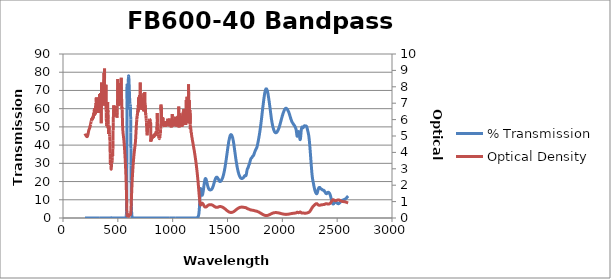
| Category | % Transmission |
|---|---|
| 2600.0 | 12.088 |
| 2599.0 | 12.024 |
| 2598.0 | 11.945 |
| 2597.0 | 11.852 |
| 2596.0 | 11.781 |
| 2595.0 | 11.749 |
| 2594.0 | 11.698 |
| 2593.0 | 11.626 |
| 2592.0 | 11.55 |
| 2591.0 | 11.475 |
| 2590.0 | 11.388 |
| 2589.0 | 11.308 |
| 2588.0 | 11.244 |
| 2587.0 | 11.174 |
| 2586.0 | 11.103 |
| 2585.0 | 11.022 |
| 2584.0 | 10.943 |
| 2583.0 | 10.886 |
| 2582.0 | 10.82 |
| 2581.0 | 10.776 |
| 2580.0 | 10.719 |
| 2579.0 | 10.668 |
| 2578.0 | 10.616 |
| 2577.0 | 10.562 |
| 2576.0 | 10.504 |
| 2575.0 | 10.454 |
| 2574.0 | 10.401 |
| 2573.0 | 10.364 |
| 2572.0 | 10.336 |
| 2571.0 | 10.315 |
| 2570.0 | 10.286 |
| 2569.0 | 10.258 |
| 2568.0 | 10.228 |
| 2567.0 | 10.186 |
| 2566.0 | 10.153 |
| 2565.0 | 10.121 |
| 2564.0 | 10.084 |
| 2563.0 | 10.085 |
| 2562.0 | 10.073 |
| 2561.0 | 10.053 |
| 2560.0 | 10.052 |
| 2559.0 | 10.033 |
| 2558.0 | 10.026 |
| 2557.0 | 9.988 |
| 2556.0 | 9.961 |
| 2555.0 | 9.93 |
| 2554.0 | 9.906 |
| 2553.0 | 9.857 |
| 2552.0 | 9.844 |
| 2551.0 | 9.828 |
| 2550.0 | 9.8 |
| 2549.0 | 9.774 |
| 2548.0 | 9.735 |
| 2547.0 | 9.714 |
| 2546.0 | 9.678 |
| 2545.0 | 9.637 |
| 2544.0 | 9.603 |
| 2543.0 | 9.558 |
| 2542.0 | 9.521 |
| 2541.0 | 9.468 |
| 2540.0 | 9.435 |
| 2539.0 | 9.381 |
| 2538.0 | 9.325 |
| 2537.0 | 9.271 |
| 2536.0 | 9.228 |
| 2535.0 | 9.161 |
| 2534.0 | 9.098 |
| 2533.0 | 9.033 |
| 2532.0 | 8.983 |
| 2531.0 | 8.903 |
| 2530.0 | 8.838 |
| 2529.0 | 8.762 |
| 2528.0 | 8.678 |
| 2527.0 | 8.596 |
| 2526.0 | 8.525 |
| 2525.0 | 8.452 |
| 2524.0 | 8.369 |
| 2523.0 | 8.305 |
| 2522.0 | 8.236 |
| 2521.0 | 8.174 |
| 2520.0 | 8.112 |
| 2519.0 | 8.058 |
| 2518.0 | 8.012 |
| 2517.0 | 7.968 |
| 2516.0 | 7.927 |
| 2515.0 | 7.912 |
| 2514.0 | 7.875 |
| 2513.0 | 7.856 |
| 2512.0 | 7.847 |
| 2511.0 | 7.842 |
| 2510.0 | 7.848 |
| 2509.0 | 7.859 |
| 2508.0 | 7.868 |
| 2507.0 | 7.887 |
| 2506.0 | 7.912 |
| 2505.0 | 7.95 |
| 2504.0 | 7.978 |
| 2503.0 | 8.02 |
| 2502.0 | 8.069 |
| 2501.0 | 8.116 |
| 2500.0 | 8.161 |
| 2499.0 | 8.207 |
| 2498.0 | 8.265 |
| 2497.0 | 8.306 |
| 2496.0 | 8.359 |
| 2495.0 | 8.409 |
| 2494.0 | 8.46 |
| 2493.0 | 8.514 |
| 2492.0 | 8.564 |
| 2491.0 | 8.603 |
| 2490.0 | 8.642 |
| 2489.0 | 8.681 |
| 2488.0 | 8.713 |
| 2487.0 | 8.735 |
| 2486.0 | 8.753 |
| 2485.0 | 8.774 |
| 2484.0 | 8.775 |
| 2483.0 | 8.772 |
| 2482.0 | 8.765 |
| 2481.0 | 8.741 |
| 2480.0 | 8.7 |
| 2479.0 | 8.664 |
| 2478.0 | 8.61 |
| 2477.0 | 8.537 |
| 2476.0 | 8.47 |
| 2475.0 | 8.387 |
| 2474.0 | 8.296 |
| 2473.0 | 8.217 |
| 2472.0 | 8.122 |
| 2471.0 | 8.035 |
| 2470.0 | 7.957 |
| 2469.0 | 7.882 |
| 2468.0 | 7.815 |
| 2467.0 | 7.758 |
| 2466.0 | 7.72 |
| 2465.0 | 7.691 |
| 2464.0 | 7.686 |
| 2463.0 | 7.692 |
| 2462.0 | 7.725 |
| 2461.0 | 7.771 |
| 2460.0 | 7.84 |
| 2459.0 | 7.925 |
| 2458.0 | 8.032 |
| 2457.0 | 8.164 |
| 2456.0 | 8.309 |
| 2455.0 | 8.478 |
| 2454.0 | 8.658 |
| 2453.0 | 8.852 |
| 2452.0 | 9.072 |
| 2451.0 | 9.29 |
| 2450.0 | 9.52 |
| 2449.0 | 9.771 |
| 2448.0 | 10.017 |
| 2447.0 | 10.268 |
| 2446.0 | 10.522 |
| 2445.0 | 10.749 |
| 2444.0 | 11.006 |
| 2443.0 | 11.248 |
| 2442.0 | 11.497 |
| 2441.0 | 11.726 |
| 2440.0 | 11.958 |
| 2439.0 | 12.168 |
| 2438.0 | 12.352 |
| 2437.0 | 12.547 |
| 2436.0 | 12.706 |
| 2435.0 | 12.878 |
| 2434.0 | 13.022 |
| 2433.0 | 13.165 |
| 2432.0 | 13.303 |
| 2431.0 | 13.425 |
| 2430.0 | 13.526 |
| 2429.0 | 13.622 |
| 2428.0 | 13.69 |
| 2427.0 | 13.762 |
| 2426.0 | 13.844 |
| 2425.0 | 13.892 |
| 2424.0 | 13.973 |
| 2423.0 | 14.026 |
| 2422.0 | 14.053 |
| 2421.0 | 14.081 |
| 2420.0 | 14.083 |
| 2419.0 | 14.084 |
| 2418.0 | 14.083 |
| 2417.0 | 14.07 |
| 2416.0 | 14.048 |
| 2415.0 | 14.048 |
| 2414.0 | 13.989 |
| 2413.0 | 13.932 |
| 2412.0 | 13.876 |
| 2411.0 | 13.771 |
| 2410.0 | 13.717 |
| 2409.0 | 13.661 |
| 2408.0 | 13.575 |
| 2407.0 | 13.529 |
| 2406.0 | 13.455 |
| 2405.0 | 13.407 |
| 2404.0 | 13.374 |
| 2403.0 | 13.354 |
| 2402.0 | 13.349 |
| 2401.0 | 13.367 |
| 2400.0 | 13.4 |
| 2399.0 | 13.436 |
| 2398.0 | 13.489 |
| 2397.0 | 13.551 |
| 2396.0 | 13.627 |
| 2395.0 | 13.708 |
| 2394.0 | 13.798 |
| 2393.0 | 13.894 |
| 2392.0 | 13.988 |
| 2391.0 | 14.082 |
| 2390.0 | 14.18 |
| 2389.0 | 14.262 |
| 2388.0 | 14.362 |
| 2387.0 | 14.457 |
| 2386.0 | 14.548 |
| 2385.0 | 14.65 |
| 2384.0 | 14.749 |
| 2383.0 | 14.821 |
| 2382.0 | 14.912 |
| 2381.0 | 14.973 |
| 2380.0 | 15.032 |
| 2379.0 | 15.095 |
| 2378.0 | 15.148 |
| 2377.0 | 15.2 |
| 2376.0 | 15.22 |
| 2375.0 | 15.249 |
| 2374.0 | 15.252 |
| 2373.0 | 15.253 |
| 2372.0 | 15.27 |
| 2371.0 | 15.285 |
| 2370.0 | 15.294 |
| 2369.0 | 15.309 |
| 2368.0 | 15.325 |
| 2367.0 | 15.347 |
| 2366.0 | 15.38 |
| 2365.0 | 15.411 |
| 2364.0 | 15.455 |
| 2363.0 | 15.508 |
| 2362.0 | 15.564 |
| 2361.0 | 15.618 |
| 2360.0 | 15.679 |
| 2359.0 | 15.724 |
| 2358.0 | 15.801 |
| 2357.0 | 15.831 |
| 2356.0 | 15.859 |
| 2355.0 | 15.908 |
| 2354.0 | 15.935 |
| 2353.0 | 15.956 |
| 2352.0 | 16 |
| 2351.0 | 16.054 |
| 2350.0 | 16.111 |
| 2349.0 | 16.175 |
| 2348.0 | 16.248 |
| 2347.0 | 16.33 |
| 2346.0 | 16.403 |
| 2345.0 | 16.46 |
| 2344.0 | 16.551 |
| 2343.0 | 16.606 |
| 2342.0 | 16.684 |
| 2341.0 | 16.763 |
| 2340.0 | 16.78 |
| 2339.0 | 16.798 |
| 2338.0 | 16.782 |
| 2337.0 | 16.771 |
| 2336.0 | 16.753 |
| 2335.0 | 16.684 |
| 2334.0 | 16.663 |
| 2333.0 | 16.563 |
| 2332.0 | 16.45 |
| 2331.0 | 16.353 |
| 2330.0 | 16.222 |
| 2329.0 | 16.072 |
| 2328.0 | 15.921 |
| 2327.0 | 15.722 |
| 2326.0 | 15.526 |
| 2325.0 | 15.309 |
| 2324.0 | 15.085 |
| 2323.0 | 14.848 |
| 2322.0 | 14.602 |
| 2321.0 | 14.371 |
| 2320.0 | 14.121 |
| 2319.0 | 13.919 |
| 2318.0 | 13.76 |
| 2317.0 | 13.581 |
| 2316.0 | 13.46 |
| 2315.0 | 13.375 |
| 2314.0 | 13.311 |
| 2313.0 | 13.32 |
| 2312.0 | 13.327 |
| 2311.0 | 13.355 |
| 2310.0 | 13.437 |
| 2309.0 | 13.502 |
| 2308.0 | 13.573 |
| 2307.0 | 13.687 |
| 2306.0 | 13.789 |
| 2305.0 | 13.9 |
| 2304.0 | 14.04 |
| 2303.0 | 14.174 |
| 2302.0 | 14.293 |
| 2301.0 | 14.459 |
| 2300.0 | 14.627 |
| 2299.0 | 14.776 |
| 2298.0 | 14.995 |
| 2297.0 | 15.175 |
| 2296.0 | 15.4 |
| 2295.0 | 15.648 |
| 2294.0 | 15.873 |
| 2293.0 | 16.132 |
| 2292.0 | 16.416 |
| 2291.0 | 16.679 |
| 2290.0 | 16.969 |
| 2289.0 | 17.274 |
| 2288.0 | 17.57 |
| 2287.0 | 17.902 |
| 2286.0 | 18.207 |
| 2285.0 | 18.524 |
| 2284.0 | 18.825 |
| 2283.0 | 19.16 |
| 2282.0 | 19.465 |
| 2281.0 | 19.785 |
| 2280.0 | 20.115 |
| 2279.0 | 20.416 |
| 2278.0 | 20.738 |
| 2277.0 | 21.077 |
| 2276.0 | 21.461 |
| 2275.0 | 21.857 |
| 2274.0 | 22.306 |
| 2273.0 | 22.787 |
| 2272.0 | 23.302 |
| 2271.0 | 23.883 |
| 2270.0 | 24.468 |
| 2269.0 | 25.119 |
| 2268.0 | 25.886 |
| 2267.0 | 26.588 |
| 2266.0 | 27.314 |
| 2265.0 | 28.1 |
| 2264.0 | 28.868 |
| 2263.0 | 29.616 |
| 2262.0 | 30.466 |
| 2261.0 | 31.256 |
| 2260.0 | 32.057 |
| 2259.0 | 32.885 |
| 2258.0 | 33.709 |
| 2257.0 | 34.491 |
| 2256.0 | 35.293 |
| 2255.0 | 36.123 |
| 2254.0 | 36.88 |
| 2253.0 | 37.714 |
| 2252.0 | 38.48 |
| 2251.0 | 39.226 |
| 2250.0 | 39.919 |
| 2249.0 | 40.637 |
| 2248.0 | 41.358 |
| 2247.0 | 42.047 |
| 2246.0 | 42.59 |
| 2245.0 | 43.208 |
| 2244.0 | 43.712 |
| 2243.0 | 44.231 |
| 2242.0 | 44.743 |
| 2241.0 | 45.14 |
| 2240.0 | 45.504 |
| 2239.0 | 45.929 |
| 2238.0 | 46.194 |
| 2237.0 | 46.514 |
| 2236.0 | 46.794 |
| 2235.0 | 47.073 |
| 2234.0 | 47.27 |
| 2233.0 | 47.534 |
| 2232.0 | 47.775 |
| 2231.0 | 48.027 |
| 2230.0 | 48.232 |
| 2229.0 | 48.561 |
| 2228.0 | 48.783 |
| 2227.0 | 49.029 |
| 2226.0 | 49.312 |
| 2225.0 | 49.468 |
| 2224.0 | 49.762 |
| 2223.0 | 49.926 |
| 2222.0 | 50.079 |
| 2221.0 | 50.216 |
| 2220.0 | 50.289 |
| 2219.0 | 50.379 |
| 2218.0 | 50.44 |
| 2217.0 | 50.471 |
| 2216.0 | 50.476 |
| 2215.0 | 50.552 |
| 2214.0 | 50.438 |
| 2213.0 | 50.453 |
| 2212.0 | 50.496 |
| 2211.0 | 50.441 |
| 2210.0 | 50.551 |
| 2209.0 | 50.467 |
| 2208.0 | 50.533 |
| 2207.0 | 50.47 |
| 2206.0 | 50.503 |
| 2205.0 | 50.574 |
| 2204.0 | 50.509 |
| 2203.0 | 50.598 |
| 2202.0 | 50.591 |
| 2201.0 | 50.573 |
| 2200.0 | 50.574 |
| 2199.0 | 50.48 |
| 2198.0 | 50.439 |
| 2197.0 | 50.38 |
| 2196.0 | 50.303 |
| 2195.0 | 50.163 |
| 2194.0 | 50.046 |
| 2193.0 | 49.858 |
| 2192.0 | 49.746 |
| 2191.0 | 49.691 |
| 2190.0 | 49.611 |
| 2189.0 | 49.632 |
| 2188.0 | 49.489 |
| 2187.0 | 49.577 |
| 2186.0 | 49.616 |
| 2185.0 | 49.693 |
| 2184.0 | 49.818 |
| 2183.0 | 49.849 |
| 2182.0 | 49.93 |
| 2181.0 | 49.929 |
| 2180.0 | 49.917 |
| 2179.0 | 49.907 |
| 2178.0 | 49.833 |
| 2177.0 | 49.754 |
| 2176.0 | 49.517 |
| 2175.0 | 49.206 |
| 2174.0 | 48.84 |
| 2173.0 | 48.364 |
| 2172.0 | 47.858 |
| 2171.0 | 47.23 |
| 2170.0 | 46.536 |
| 2169.0 | 45.799 |
| 2168.0 | 45.196 |
| 2167.0 | 44.526 |
| 2166.0 | 43.968 |
| 2165.0 | 43.493 |
| 2164.0 | 43.163 |
| 2163.0 | 43.016 |
| 2162.0 | 43.036 |
| 2161.0 | 43.167 |
| 2160.0 | 43.414 |
| 2159.0 | 43.814 |
| 2158.0 | 44.221 |
| 2157.0 | 44.702 |
| 2156.0 | 45.159 |
| 2155.0 | 45.652 |
| 2154.0 | 46.068 |
| 2153.0 | 46.504 |
| 2152.0 | 46.82 |
| 2151.0 | 47.105 |
| 2150.0 | 47.289 |
| 2149.0 | 47.407 |
| 2148.0 | 47.425 |
| 2147.0 | 47.378 |
| 2146.0 | 47.261 |
| 2145.0 | 47.062 |
| 2144.0 | 46.791 |
| 2143.0 | 46.552 |
| 2142.0 | 46.213 |
| 2141.0 | 45.835 |
| 2140.0 | 45.509 |
| 2139.0 | 45.229 |
| 2138.0 | 44.994 |
| 2137.0 | 44.857 |
| 2136.0 | 44.82 |
| 2135.0 | 44.873 |
| 2134.0 | 45.065 |
| 2133.0 | 45.367 |
| 2132.0 | 45.777 |
| 2131.0 | 46.249 |
| 2130.0 | 46.695 |
| 2129.0 | 47.183 |
| 2128.0 | 47.588 |
| 2127.0 | 48.036 |
| 2126.0 | 48.397 |
| 2125.0 | 48.64 |
| 2124.0 | 48.892 |
| 2123.0 | 49.116 |
| 2122.0 | 49.263 |
| 2121.0 | 49.399 |
| 2120.0 | 49.547 |
| 2119.0 | 49.666 |
| 2118.0 | 49.834 |
| 2117.0 | 49.948 |
| 2116.0 | 50.033 |
| 2115.0 | 50.14 |
| 2114.0 | 50.289 |
| 2113.0 | 50.371 |
| 2112.0 | 50.546 |
| 2111.0 | 50.58 |
| 2110.0 | 50.678 |
| 2109.0 | 50.811 |
| 2108.0 | 50.835 |
| 2107.0 | 50.988 |
| 2106.0 | 51.107 |
| 2105.0 | 51.142 |
| 2104.0 | 51.305 |
| 2103.0 | 51.361 |
| 2102.0 | 51.423 |
| 2101.0 | 51.481 |
| 2100.0 | 51.59 |
| 2099.0 | 51.712 |
| 2098.0 | 51.801 |
| 2097.0 | 51.842 |
| 2096.0 | 51.996 |
| 2095.0 | 52.056 |
| 2094.0 | 52.136 |
| 2093.0 | 52.234 |
| 2092.0 | 52.366 |
| 2091.0 | 52.486 |
| 2090.0 | 52.544 |
| 2089.0 | 52.661 |
| 2088.0 | 52.82 |
| 2087.0 | 52.955 |
| 2086.0 | 52.975 |
| 2085.0 | 53.214 |
| 2084.0 | 53.35 |
| 2083.0 | 53.514 |
| 2082.0 | 53.686 |
| 2081.0 | 53.851 |
| 2080.0 | 53.998 |
| 2079.0 | 54.191 |
| 2078.0 | 54.361 |
| 2077.0 | 54.515 |
| 2076.0 | 54.77 |
| 2075.0 | 54.915 |
| 2074.0 | 55.139 |
| 2073.0 | 55.291 |
| 2072.0 | 55.553 |
| 2071.0 | 55.738 |
| 2070.0 | 55.937 |
| 2069.0 | 56.123 |
| 2068.0 | 56.295 |
| 2067.0 | 56.528 |
| 2066.0 | 56.738 |
| 2065.0 | 56.916 |
| 2064.0 | 57.095 |
| 2063.0 | 57.231 |
| 2062.0 | 57.466 |
| 2061.0 | 57.656 |
| 2060.0 | 57.806 |
| 2059.0 | 57.988 |
| 2058.0 | 58.098 |
| 2057.0 | 58.237 |
| 2056.0 | 58.382 |
| 2055.0 | 58.582 |
| 2054.0 | 58.683 |
| 2053.0 | 58.845 |
| 2052.0 | 58.897 |
| 2051.0 | 59.071 |
| 2050.0 | 59.133 |
| 2049.0 | 59.272 |
| 2048.0 | 59.411 |
| 2047.0 | 59.437 |
| 2046.0 | 59.564 |
| 2045.0 | 59.609 |
| 2044.0 | 59.715 |
| 2043.0 | 59.785 |
| 2042.0 | 59.855 |
| 2041.0 | 59.933 |
| 2040.0 | 59.988 |
| 2039.0 | 60.023 |
| 2038.0 | 60.061 |
| 2037.0 | 60.194 |
| 2036.0 | 60.102 |
| 2035.0 | 60.204 |
| 2034.0 | 60.152 |
| 2033.0 | 60.26 |
| 2032.0 | 60.161 |
| 2031.0 | 60.14 |
| 2030.0 | 60.197 |
| 2029.0 | 60.086 |
| 2028.0 | 60.126 |
| 2027.0 | 60.053 |
| 2026.0 | 59.989 |
| 2025.0 | 59.856 |
| 2024.0 | 59.8 |
| 2023.0 | 59.758 |
| 2022.0 | 59.701 |
| 2021.0 | 59.605 |
| 2020.0 | 59.44 |
| 2019.0 | 59.265 |
| 2018.0 | 59.158 |
| 2017.0 | 59.055 |
| 2016.0 | 58.936 |
| 2015.0 | 58.796 |
| 2014.0 | 58.64 |
| 2013.0 | 58.397 |
| 2012.0 | 58.249 |
| 2011.0 | 58.082 |
| 2010.0 | 57.955 |
| 2009.0 | 57.742 |
| 2008.0 | 57.57 |
| 2007.0 | 57.354 |
| 2006.0 | 57.277 |
| 2005.0 | 57.045 |
| 2004.0 | 56.877 |
| 2003.0 | 56.626 |
| 2002.0 | 56.423 |
| 2001.0 | 56.267 |
| 2000.0 | 56.122 |
| 1999.0 | 55.868 |
| 1998.0 | 55.599 |
| 1997.0 | 55.393 |
| 1996.0 | 55.233 |
| 1995.0 | 55.04 |
| 1994.0 | 54.794 |
| 1993.0 | 54.546 |
| 1992.0 | 54.287 |
| 1991.0 | 54.125 |
| 1990.0 | 53.855 |
| 1989.0 | 53.673 |
| 1988.0 | 53.419 |
| 1987.0 | 53.143 |
| 1986.0 | 52.894 |
| 1985.0 | 52.742 |
| 1984.0 | 52.528 |
| 1983.0 | 52.284 |
| 1982.0 | 52.051 |
| 1981.0 | 51.814 |
| 1980.0 | 51.647 |
| 1979.0 | 51.401 |
| 1978.0 | 51.199 |
| 1977.0 | 50.952 |
| 1976.0 | 50.786 |
| 1975.0 | 50.545 |
| 1974.0 | 50.448 |
| 1973.0 | 50.171 |
| 1972.0 | 49.932 |
| 1971.0 | 49.747 |
| 1970.0 | 49.6 |
| 1969.0 | 49.403 |
| 1968.0 | 49.283 |
| 1967.0 | 49.072 |
| 1966.0 | 48.908 |
| 1965.0 | 48.761 |
| 1964.0 | 48.644 |
| 1963.0 | 48.498 |
| 1962.0 | 48.36 |
| 1961.0 | 48.18 |
| 1960.0 | 48.049 |
| 1959.0 | 47.984 |
| 1958.0 | 47.827 |
| 1957.0 | 47.775 |
| 1956.0 | 47.607 |
| 1955.0 | 47.537 |
| 1954.0 | 47.416 |
| 1953.0 | 47.364 |
| 1952.0 | 47.229 |
| 1951.0 | 47.196 |
| 1950.0 | 47.071 |
| 1949.0 | 47.077 |
| 1948.0 | 47.009 |
| 1947.0 | 46.962 |
| 1946.0 | 46.849 |
| 1945.0 | 46.825 |
| 1944.0 | 46.825 |
| 1943.0 | 46.834 |
| 1942.0 | 46.774 |
| 1941.0 | 46.76 |
| 1940.0 | 46.737 |
| 1939.0 | 46.783 |
| 1938.0 | 46.784 |
| 1937.0 | 46.857 |
| 1936.0 | 46.848 |
| 1935.0 | 46.906 |
| 1934.0 | 46.984 |
| 1933.0 | 47.055 |
| 1932.0 | 47.053 |
| 1931.0 | 47.18 |
| 1930.0 | 47.25 |
| 1929.0 | 47.35 |
| 1928.0 | 47.454 |
| 1927.0 | 47.622 |
| 1926.0 | 47.739 |
| 1925.0 | 47.866 |
| 1924.0 | 48.032 |
| 1923.0 | 48.216 |
| 1922.0 | 48.314 |
| 1921.0 | 48.498 |
| 1920.0 | 48.646 |
| 1919.0 | 48.948 |
| 1918.0 | 49.176 |
| 1917.0 | 49.346 |
| 1916.0 | 49.522 |
| 1915.0 | 49.715 |
| 1914.0 | 49.983 |
| 1913.0 | 50.264 |
| 1912.0 | 50.542 |
| 1911.0 | 50.816 |
| 1910.0 | 51.094 |
| 1909.0 | 51.418 |
| 1908.0 | 51.658 |
| 1907.0 | 52.023 |
| 1906.0 | 52.264 |
| 1905.0 | 52.743 |
| 1904.0 | 53.089 |
| 1903.0 | 53.547 |
| 1902.0 | 53.83 |
| 1901.0 | 54.267 |
| 1900.0 | 54.578 |
| 1899.0 | 55.105 |
| 1898.0 | 55.531 |
| 1897.0 | 56.068 |
| 1896.0 | 56.466 |
| 1895.0 | 56.942 |
| 1894.0 | 57.384 |
| 1893.0 | 57.867 |
| 1892.0 | 58.23 |
| 1891.0 | 58.85 |
| 1890.0 | 59.289 |
| 1889.0 | 59.914 |
| 1888.0 | 60.324 |
| 1887.0 | 60.801 |
| 1886.0 | 61.139 |
| 1885.0 | 61.637 |
| 1884.0 | 62.083 |
| 1883.0 | 62.609 |
| 1882.0 | 63.06 |
| 1881.0 | 63.469 |
| 1880.0 | 63.952 |
| 1879.0 | 64.35 |
| 1878.0 | 64.707 |
| 1877.0 | 65.108 |
| 1876.0 | 65.582 |
| 1875.0 | 65.951 |
| 1874.0 | 66.32 |
| 1873.0 | 66.705 |
| 1872.0 | 67.082 |
| 1871.0 | 67.419 |
| 1870.0 | 67.865 |
| 1869.0 | 68.179 |
| 1868.0 | 68.546 |
| 1867.0 | 68.807 |
| 1866.0 | 69.157 |
| 1865.0 | 69.371 |
| 1864.0 | 69.633 |
| 1863.0 | 69.772 |
| 1862.0 | 69.965 |
| 1861.0 | 70.279 |
| 1860.0 | 70.33 |
| 1859.0 | 70.549 |
| 1858.0 | 70.628 |
| 1857.0 | 70.804 |
| 1856.0 | 70.777 |
| 1855.0 | 70.823 |
| 1854.0 | 70.804 |
| 1853.0 | 70.779 |
| 1852.0 | 70.852 |
| 1851.0 | 70.861 |
| 1850.0 | 70.804 |
| 1849.0 | 70.579 |
| 1848.0 | 70.533 |
| 1847.0 | 70.306 |
| 1846.0 | 70.242 |
| 1845.0 | 69.999 |
| 1844.0 | 69.798 |
| 1843.0 | 69.476 |
| 1842.0 | 69.277 |
| 1841.0 | 68.981 |
| 1840.0 | 68.734 |
| 1839.0 | 68.437 |
| 1838.0 | 67.979 |
| 1837.0 | 67.631 |
| 1836.0 | 67.223 |
| 1835.0 | 66.893 |
| 1834.0 | 66.355 |
| 1833.0 | 66.034 |
| 1832.0 | 65.499 |
| 1831.0 | 65.064 |
| 1830.0 | 64.503 |
| 1829.0 | 64.111 |
| 1828.0 | 63.68 |
| 1827.0 | 63.073 |
| 1826.0 | 62.555 |
| 1825.0 | 62.068 |
| 1824.0 | 61.639 |
| 1823.0 | 61.185 |
| 1822.0 | 60.599 |
| 1821.0 | 60.074 |
| 1820.0 | 59.594 |
| 1819.0 | 59.1 |
| 1818.0 | 58.55 |
| 1817.0 | 58.07 |
| 1816.0 | 57.483 |
| 1815.0 | 57.035 |
| 1814.0 | 56.46 |
| 1813.0 | 55.972 |
| 1812.0 | 55.379 |
| 1811.0 | 54.838 |
| 1810.0 | 54.408 |
| 1809.0 | 53.815 |
| 1808.0 | 53.375 |
| 1807.0 | 52.866 |
| 1806.0 | 52.382 |
| 1805.0 | 51.88 |
| 1804.0 | 51.384 |
| 1803.0 | 50.963 |
| 1802.0 | 50.479 |
| 1801.0 | 50.074 |
| 1800.0 | 49.573 |
| 1799.0 | 49.101 |
| 1798.0 | 48.693 |
| 1797.0 | 48.326 |
| 1796.0 | 47.874 |
| 1795.0 | 47.43 |
| 1794.0 | 47.062 |
| 1793.0 | 46.67 |
| 1792.0 | 46.236 |
| 1791.0 | 45.846 |
| 1790.0 | 45.504 |
| 1789.0 | 45.178 |
| 1788.0 | 44.785 |
| 1787.0 | 44.472 |
| 1786.0 | 44.078 |
| 1785.0 | 43.802 |
| 1784.0 | 43.446 |
| 1783.0 | 43.088 |
| 1782.0 | 42.792 |
| 1781.0 | 42.465 |
| 1780.0 | 42.148 |
| 1779.0 | 41.8 |
| 1778.0 | 41.516 |
| 1777.0 | 41.246 |
| 1776.0 | 40.899 |
| 1775.0 | 40.59 |
| 1774.0 | 40.299 |
| 1773.0 | 40.046 |
| 1772.0 | 39.764 |
| 1771.0 | 39.512 |
| 1770.0 | 39.274 |
| 1769.0 | 39.081 |
| 1768.0 | 38.923 |
| 1767.0 | 38.735 |
| 1766.0 | 38.525 |
| 1765.0 | 38.443 |
| 1764.0 | 38.289 |
| 1763.0 | 38.22 |
| 1762.0 | 38.007 |
| 1761.0 | 37.906 |
| 1760.0 | 37.836 |
| 1759.0 | 37.69 |
| 1758.0 | 37.602 |
| 1757.0 | 37.442 |
| 1756.0 | 37.384 |
| 1755.0 | 37.22 |
| 1754.0 | 37.046 |
| 1753.0 | 36.897 |
| 1752.0 | 36.753 |
| 1751.0 | 36.619 |
| 1750.0 | 36.446 |
| 1749.0 | 36.272 |
| 1748.0 | 36.143 |
| 1747.0 | 35.935 |
| 1746.0 | 35.787 |
| 1745.0 | 35.591 |
| 1744.0 | 35.393 |
| 1743.0 | 35.253 |
| 1742.0 | 35.059 |
| 1741.0 | 34.848 |
| 1740.0 | 34.747 |
| 1739.0 | 34.589 |
| 1738.0 | 34.48 |
| 1737.0 | 34.355 |
| 1736.0 | 34.265 |
| 1735.0 | 34.202 |
| 1734.0 | 34.097 |
| 1733.0 | 34.014 |
| 1732.0 | 33.956 |
| 1731.0 | 33.908 |
| 1730.0 | 33.889 |
| 1729.0 | 33.777 |
| 1728.0 | 33.718 |
| 1727.0 | 33.654 |
| 1726.0 | 33.529 |
| 1725.0 | 33.415 |
| 1724.0 | 33.34 |
| 1723.0 | 33.211 |
| 1722.0 | 33.142 |
| 1721.0 | 33.039 |
| 1720.0 | 32.976 |
| 1719.0 | 32.923 |
| 1718.0 | 32.842 |
| 1717.0 | 32.837 |
| 1716.0 | 32.798 |
| 1715.0 | 32.701 |
| 1714.0 | 32.618 |
| 1713.0 | 32.48 |
| 1712.0 | 32.377 |
| 1711.0 | 32.206 |
| 1710.0 | 32.001 |
| 1709.0 | 31.809 |
| 1708.0 | 31.602 |
| 1707.0 | 31.354 |
| 1706.0 | 31.121 |
| 1705.0 | 30.857 |
| 1704.0 | 30.626 |
| 1703.0 | 30.362 |
| 1702.0 | 30.101 |
| 1701.0 | 29.891 |
| 1700.0 | 29.656 |
| 1699.0 | 29.486 |
| 1698.0 | 29.374 |
| 1697.0 | 29.257 |
| 1696.0 | 29.148 |
| 1695.0 | 29.015 |
| 1694.0 | 28.881 |
| 1693.0 | 28.667 |
| 1692.0 | 28.48 |
| 1691.0 | 28.224 |
| 1690.0 | 28 |
| 1689.0 | 27.791 |
| 1688.0 | 27.642 |
| 1687.0 | 27.521 |
| 1686.0 | 27.411 |
| 1685.0 | 27.331 |
| 1684.0 | 27.254 |
| 1683.0 | 27.166 |
| 1682.0 | 27.031 |
| 1681.0 | 26.876 |
| 1680.0 | 26.684 |
| 1679.0 | 26.431 |
| 1678.0 | 26.133 |
| 1677.0 | 25.812 |
| 1676.0 | 25.432 |
| 1675.0 | 25.092 |
| 1674.0 | 24.727 |
| 1673.0 | 24.397 |
| 1672.0 | 24.08 |
| 1671.0 | 23.821 |
| 1670.0 | 23.578 |
| 1669.0 | 23.432 |
| 1668.0 | 23.284 |
| 1667.0 | 23.227 |
| 1666.0 | 23.209 |
| 1665.0 | 23.245 |
| 1664.0 | 23.278 |
| 1663.0 | 23.301 |
| 1662.0 | 23.318 |
| 1661.0 | 23.354 |
| 1660.0 | 23.339 |
| 1659.0 | 23.301 |
| 1658.0 | 23.28 |
| 1657.0 | 23.21 |
| 1656.0 | 23.122 |
| 1655.0 | 23.034 |
| 1654.0 | 22.973 |
| 1653.0 | 22.878 |
| 1652.0 | 22.735 |
| 1651.0 | 22.642 |
| 1650.0 | 22.55 |
| 1649.0 | 22.431 |
| 1648.0 | 22.321 |
| 1647.0 | 22.25 |
| 1646.0 | 22.197 |
| 1645.0 | 22.118 |
| 1644.0 | 22.073 |
| 1643.0 | 22.053 |
| 1642.0 | 21.978 |
| 1641.0 | 21.963 |
| 1640.0 | 21.923 |
| 1639.0 | 21.869 |
| 1638.0 | 21.821 |
| 1637.0 | 21.78 |
| 1636.0 | 21.751 |
| 1635.0 | 21.704 |
| 1634.0 | 21.671 |
| 1633.0 | 21.676 |
| 1632.0 | 21.662 |
| 1631.0 | 21.66 |
| 1630.0 | 21.65 |
| 1629.0 | 21.692 |
| 1628.0 | 21.714 |
| 1627.0 | 21.724 |
| 1626.0 | 21.75 |
| 1625.0 | 21.789 |
| 1624.0 | 21.801 |
| 1623.0 | 21.839 |
| 1622.0 | 21.911 |
| 1621.0 | 21.947 |
| 1620.0 | 22.011 |
| 1619.0 | 22.074 |
| 1618.0 | 22.15 |
| 1617.0 | 22.236 |
| 1616.0 | 22.311 |
| 1615.0 | 22.422 |
| 1614.0 | 22.545 |
| 1613.0 | 22.648 |
| 1612.0 | 22.773 |
| 1611.0 | 22.915 |
| 1610.0 | 23.051 |
| 1609.0 | 23.197 |
| 1608.0 | 23.339 |
| 1607.0 | 23.492 |
| 1606.0 | 23.65 |
| 1605.0 | 23.833 |
| 1604.0 | 24.008 |
| 1603.0 | 24.181 |
| 1602.0 | 24.389 |
| 1601.0 | 24.605 |
| 1600.0 | 24.821 |
| 1599.0 | 25.035 |
| 1598.0 | 25.272 |
| 1597.0 | 25.515 |
| 1596.0 | 25.743 |
| 1595.0 | 26.003 |
| 1594.0 | 26.269 |
| 1593.0 | 26.539 |
| 1592.0 | 26.799 |
| 1591.0 | 27.11 |
| 1590.0 | 27.408 |
| 1589.0 | 27.719 |
| 1588.0 | 28.044 |
| 1587.0 | 28.348 |
| 1586.0 | 28.718 |
| 1585.0 | 29.02 |
| 1584.0 | 29.371 |
| 1583.0 | 29.759 |
| 1582.0 | 30.106 |
| 1581.0 | 30.508 |
| 1580.0 | 30.89 |
| 1579.0 | 31.271 |
| 1578.0 | 31.646 |
| 1577.0 | 32.059 |
| 1576.0 | 32.476 |
| 1575.0 | 32.91 |
| 1574.0 | 33.305 |
| 1573.0 | 33.77 |
| 1572.0 | 34.232 |
| 1571.0 | 34.642 |
| 1570.0 | 35.083 |
| 1569.0 | 35.542 |
| 1568.0 | 35.987 |
| 1567.0 | 36.422 |
| 1566.0 | 36.916 |
| 1565.0 | 37.297 |
| 1564.0 | 37.761 |
| 1563.0 | 38.239 |
| 1562.0 | 38.653 |
| 1561.0 | 39.087 |
| 1560.0 | 39.546 |
| 1559.0 | 39.932 |
| 1558.0 | 40.316 |
| 1557.0 | 40.751 |
| 1556.0 | 41.135 |
| 1555.0 | 41.491 |
| 1554.0 | 41.851 |
| 1553.0 | 42.206 |
| 1552.0 | 42.489 |
| 1551.0 | 42.824 |
| 1550.0 | 43.132 |
| 1549.0 | 43.432 |
| 1548.0 | 43.655 |
| 1547.0 | 43.959 |
| 1546.0 | 44.141 |
| 1545.0 | 44.352 |
| 1544.0 | 44.576 |
| 1543.0 | 44.727 |
| 1542.0 | 44.895 |
| 1541.0 | 45.107 |
| 1540.0 | 45.222 |
| 1539.0 | 45.304 |
| 1538.0 | 45.445 |
| 1537.0 | 45.563 |
| 1536.0 | 45.573 |
| 1535.0 | 45.673 |
| 1534.0 | 45.73 |
| 1533.0 | 45.676 |
| 1532.0 | 45.735 |
| 1531.0 | 45.745 |
| 1530.0 | 45.665 |
| 1529.0 | 45.66 |
| 1528.0 | 45.618 |
| 1527.0 | 45.48 |
| 1526.0 | 45.38 |
| 1525.0 | 45.282 |
| 1524.0 | 45.091 |
| 1523.0 | 44.909 |
| 1522.0 | 44.767 |
| 1521.0 | 44.478 |
| 1520.0 | 44.299 |
| 1519.0 | 44.103 |
| 1518.0 | 43.842 |
| 1517.0 | 43.547 |
| 1516.0 | 43.287 |
| 1515.0 | 42.98 |
| 1514.0 | 42.666 |
| 1513.0 | 42.415 |
| 1512.0 | 42.037 |
| 1511.0 | 41.7 |
| 1510.0 | 41.355 |
| 1509.0 | 40.965 |
| 1508.0 | 40.564 |
| 1507.0 | 40.227 |
| 1506.0 | 39.802 |
| 1505.0 | 39.363 |
| 1504.0 | 39 |
| 1503.0 | 38.54 |
| 1502.0 | 38.113 |
| 1501.0 | 37.746 |
| 1500.0 | 37.249 |
| 1499.0 | 36.812 |
| 1498.0 | 36.441 |
| 1497.0 | 35.953 |
| 1496.0 | 35.518 |
| 1495.0 | 35.082 |
| 1494.0 | 34.664 |
| 1493.0 | 34.21 |
| 1492.0 | 33.799 |
| 1491.0 | 33.323 |
| 1490.0 | 32.883 |
| 1489.0 | 32.487 |
| 1488.0 | 32.027 |
| 1487.0 | 31.63 |
| 1486.0 | 31.248 |
| 1485.0 | 30.794 |
| 1484.0 | 30.392 |
| 1483.0 | 30.004 |
| 1482.0 | 29.605 |
| 1481.0 | 29.217 |
| 1480.0 | 28.846 |
| 1479.0 | 28.447 |
| 1478.0 | 28.091 |
| 1477.0 | 27.742 |
| 1476.0 | 27.371 |
| 1475.0 | 27.04 |
| 1474.0 | 26.733 |
| 1473.0 | 26.385 |
| 1472.0 | 26.073 |
| 1471.0 | 25.742 |
| 1470.0 | 25.45 |
| 1469.0 | 25.177 |
| 1468.0 | 24.891 |
| 1467.0 | 24.616 |
| 1466.0 | 24.349 |
| 1465.0 | 24.081 |
| 1464.0 | 23.849 |
| 1463.0 | 23.605 |
| 1462.0 | 23.361 |
| 1461.0 | 23.164 |
| 1460.0 | 22.943 |
| 1459.0 | 22.736 |
| 1458.0 | 22.56 |
| 1457.0 | 22.34 |
| 1456.0 | 22.186 |
| 1455.0 | 22.009 |
| 1454.0 | 21.842 |
| 1453.0 | 21.709 |
| 1452.0 | 21.55 |
| 1451.0 | 21.422 |
| 1450.0 | 21.3 |
| 1449.0 | 21.166 |
| 1448.0 | 21.039 |
| 1447.0 | 20.949 |
| 1446.0 | 20.814 |
| 1445.0 | 20.71 |
| 1444.0 | 20.641 |
| 1443.0 | 20.537 |
| 1442.0 | 20.469 |
| 1441.0 | 20.39 |
| 1440.0 | 20.282 |
| 1439.0 | 20.256 |
| 1438.0 | 20.18 |
| 1437.0 | 20.136 |
| 1436.0 | 20.091 |
| 1435.0 | 20.046 |
| 1434.0 | 20.028 |
| 1433.0 | 20.026 |
| 1432.0 | 20 |
| 1431.0 | 20.017 |
| 1430.0 | 20.03 |
| 1429.0 | 20.038 |
| 1428.0 | 20.111 |
| 1427.0 | 20.159 |
| 1426.0 | 20.217 |
| 1425.0 | 20.331 |
| 1424.0 | 20.41 |
| 1423.0 | 20.513 |
| 1422.0 | 20.649 |
| 1421.0 | 20.75 |
| 1420.0 | 20.89 |
| 1419.0 | 21.009 |
| 1418.0 | 21.136 |
| 1417.0 | 21.288 |
| 1416.0 | 21.395 |
| 1415.0 | 21.491 |
| 1414.0 | 21.607 |
| 1413.0 | 21.73 |
| 1412.0 | 21.841 |
| 1411.0 | 21.942 |
| 1410.0 | 22.002 |
| 1409.0 | 22.088 |
| 1408.0 | 22.208 |
| 1407.0 | 22.219 |
| 1406.0 | 22.318 |
| 1405.0 | 22.305 |
| 1404.0 | 22.379 |
| 1403.0 | 22.417 |
| 1402.0 | 22.422 |
| 1401.0 | 22.392 |
| 1400.0 | 22.384 |
| 1399.0 | 22.364 |
| 1398.0 | 22.353 |
| 1397.0 | 22.218 |
| 1396.0 | 22.161 |
| 1395.0 | 22.083 |
| 1394.0 | 22.036 |
| 1393.0 | 21.903 |
| 1392.0 | 21.751 |
| 1391.0 | 21.68 |
| 1390.0 | 21.536 |
| 1389.0 | 21.378 |
| 1388.0 | 21.188 |
| 1387.0 | 21.04 |
| 1386.0 | 20.879 |
| 1385.0 | 20.675 |
| 1384.0 | 20.495 |
| 1383.0 | 20.275 |
| 1382.0 | 20.049 |
| 1381.0 | 19.895 |
| 1380.0 | 19.63 |
| 1379.0 | 19.454 |
| 1378.0 | 19.231 |
| 1377.0 | 19.015 |
| 1376.0 | 18.809 |
| 1375.0 | 18.601 |
| 1374.0 | 18.402 |
| 1373.0 | 18.204 |
| 1372.0 | 18.004 |
| 1371.0 | 17.809 |
| 1370.0 | 17.615 |
| 1369.0 | 17.458 |
| 1368.0 | 17.257 |
| 1367.0 | 17.111 |
| 1366.0 | 16.97 |
| 1365.0 | 16.803 |
| 1364.0 | 16.655 |
| 1363.0 | 16.536 |
| 1362.0 | 16.366 |
| 1361.0 | 16.257 |
| 1360.0 | 16.181 |
| 1359.0 | 16.046 |
| 1358.0 | 15.964 |
| 1357.0 | 15.883 |
| 1356.0 | 15.803 |
| 1355.0 | 15.715 |
| 1354.0 | 15.683 |
| 1353.0 | 15.642 |
| 1352.0 | 15.589 |
| 1351.0 | 15.554 |
| 1350.0 | 15.521 |
| 1349.0 | 15.491 |
| 1348.0 | 15.46 |
| 1347.0 | 15.449 |
| 1346.0 | 15.436 |
| 1345.0 | 15.423 |
| 1344.0 | 15.411 |
| 1343.0 | 15.401 |
| 1342.0 | 15.417 |
| 1341.0 | 15.415 |
| 1340.0 | 15.434 |
| 1339.0 | 15.448 |
| 1338.0 | 15.469 |
| 1337.0 | 15.495 |
| 1336.0 | 15.538 |
| 1335.0 | 15.577 |
| 1334.0 | 15.638 |
| 1333.0 | 15.696 |
| 1332.0 | 15.751 |
| 1331.0 | 15.842 |
| 1330.0 | 15.936 |
| 1329.0 | 16.037 |
| 1328.0 | 16.142 |
| 1327.0 | 16.275 |
| 1326.0 | 16.417 |
| 1325.0 | 16.569 |
| 1324.0 | 16.729 |
| 1323.0 | 16.904 |
| 1322.0 | 17.084 |
| 1321.0 | 17.284 |
| 1320.0 | 17.502 |
| 1319.0 | 17.746 |
| 1318.0 | 17.981 |
| 1317.0 | 18.222 |
| 1316.0 | 18.477 |
| 1315.0 | 18.735 |
| 1314.0 | 18.993 |
| 1313.0 | 19.264 |
| 1312.0 | 19.531 |
| 1311.0 | 19.777 |
| 1310.0 | 20.047 |
| 1309.0 | 20.293 |
| 1308.0 | 20.521 |
| 1307.0 | 20.781 |
| 1306.0 | 20.977 |
| 1305.0 | 21.151 |
| 1304.0 | 21.307 |
| 1303.0 | 21.448 |
| 1302.0 | 21.54 |
| 1301.0 | 21.604 |
| 1300.0 | 21.64 |
| 1299.0 | 21.621 |
| 1298.0 | 21.565 |
| 1297.0 | 21.479 |
| 1296.0 | 21.358 |
| 1295.0 | 21.205 |
| 1294.0 | 21.007 |
| 1293.0 | 20.75 |
| 1292.0 | 20.474 |
| 1291.0 | 20.146 |
| 1290.0 | 19.787 |
| 1289.0 | 19.41 |
| 1288.0 | 18.991 |
| 1287.0 | 18.535 |
| 1286.0 | 18.095 |
| 1285.0 | 17.628 |
| 1284.0 | 17.171 |
| 1283.0 | 16.686 |
| 1282.0 | 16.231 |
| 1281.0 | 15.762 |
| 1280.0 | 15.307 |
| 1279.0 | 14.905 |
| 1278.0 | 14.514 |
| 1277.0 | 14.154 |
| 1276.0 | 13.811 |
| 1275.0 | 13.5 |
| 1274.0 | 13.238 |
| 1273.0 | 13.014 |
| 1272.0 | 12.809 |
| 1271.0 | 12.651 |
| 1270.0 | 12.543 |
| 1269.0 | 12.475 |
| 1268.0 | 12.455 |
| 1267.0 | 12.49 |
| 1266.0 | 12.561 |
| 1265.0 | 12.7 |
| 1264.0 | 12.905 |
| 1263.0 | 13.16 |
| 1262.0 | 13.495 |
| 1261.0 | 13.885 |
| 1260.0 | 14.3 |
| 1259.0 | 14.783 |
| 1258.0 | 15.28 |
| 1257.0 | 15.694 |
| 1256.0 | 16.038 |
| 1255.0 | 16.211 |
| 1254.0 | 16.096 |
| 1253.0 | 15.746 |
| 1252.0 | 15.102 |
| 1251.0 | 14.204 |
| 1250.0 | 13.101 |
| 1249.0 | 11.82 |
| 1248.0 | 10.537 |
| 1247.0 | 9.201 |
| 1246.0 | 7.937 |
| 1245.0 | 6.767 |
| 1244.0 | 5.761 |
| 1243.0 | 4.895 |
| 1242.0 | 4.128 |
| 1241.0 | 3.493 |
| 1240.0 | 2.892 |
| 1239.0 | 2.399 |
| 1238.0 | 1.987 |
| 1237.0 | 1.639 |
| 1236.0 | 1.357 |
| 1235.0 | 1.13 |
| 1234.0 | 0.948 |
| 1233.0 | 0.793 |
| 1232.0 | 0.668 |
| 1231.0 | 0.563 |
| 1230.0 | 0.474 |
| 1229.0 | 0.403 |
| 1228.0 | 0.344 |
| 1227.0 | 0.295 |
| 1226.0 | 0.252 |
| 1225.0 | 0.218 |
| 1224.0 | 0.187 |
| 1223.0 | 0.161 |
| 1222.0 | 0.14 |
| 1221.0 | 0.122 |
| 1220.0 | 0.106 |
| 1219.0 | 0.093 |
| 1218.0 | 0.081 |
| 1217.0 | 0.071 |
| 1216.0 | 0.063 |
| 1215.0 | 0.056 |
| 1214.0 | 0.049 |
| 1213.0 | 0.043 |
| 1212.0 | 0.039 |
| 1211.0 | 0.034 |
| 1210.0 | 0.031 |
| 1209.0 | 0.027 |
| 1208.0 | 0.024 |
| 1207.0 | 0.022 |
| 1206.0 | 0.02 |
| 1205.0 | 0.018 |
| 1204.0 | 0.016 |
| 1203.0 | 0.015 |
| 1202.0 | 0.013 |
| 1201.0 | 0.012 |
| 1200.0 | 0.011 |
| 1199.0 | 0.01 |
| 1198.0 | 0.009 |
| 1197.0 | 0.008 |
| 1196.0 | 0.007 |
| 1195.0 | 0.007 |
| 1194.0 | 0.006 |
| 1193.0 | 0.006 |
| 1192.0 | 0.005 |
| 1191.0 | 0.005 |
| 1190.0 | 0.004 |
| 1189.0 | 0.004 |
| 1188.0 | 0.004 |
| 1187.0 | 0.003 |
| 1186.0 | 0.003 |
| 1185.0 | 0.003 |
| 1184.0 | 0.002 |
| 1183.0 | 0.002 |
| 1182.0 | 0.002 |
| 1181.0 | 0.002 |
| 1180.0 | 0.002 |
| 1179.0 | 0.002 |
| 1178.0 | 0.002 |
| 1177.0 | 0.001 |
| 1176.0 | 0.001 |
| 1175.0 | 0.001 |
| 1174.0 | 0.001 |
| 1173.0 | 0.001 |
| 1172.0 | 0.001 |
| 1171.0 | 0.001 |
| 1170.0 | 0.001 |
| 1169.0 | 0.001 |
| 1168.0 | 0.001 |
| 1167.0 | 0 |
| 1166.0 | 0 |
| 1165.0 | 0 |
| 1164.0 | 0 |
| 1163.0 | 0 |
| 1162.0 | 0 |
| 1161.0 | 0 |
| 1160.0 | 0 |
| 1159.0 | 0 |
| 1158.0 | 0 |
| 1157.0 | 0 |
| 1156.0 | 0 |
| 1155.0 | 0 |
| 1154.0 | 0 |
| 1153.0 | 0 |
| 1152.0 | 0 |
| 1151.0 | 0 |
| 1150.0 | 0 |
| 1149.0 | 0 |
| 1148.0 | 0 |
| 1147.0 | 0 |
| 1146.0 | 0 |
| 1145.0 | 0 |
| 1144.0 | 0 |
| 1143.0 | 0 |
| 1142.0 | 0 |
| 1141.0 | 0 |
| 1140.0 | 0 |
| 1139.0 | 0 |
| 1138.0 | 0 |
| 1137.0 | 0 |
| 1136.0 | 0 |
| 1135.0 | 0 |
| 1134.0 | 0 |
| 1133.0 | 0 |
| 1132.0 | 0 |
| 1131.0 | 0 |
| 1130.0 | 0 |
| 1129.0 | 0 |
| 1128.0 | 0 |
| 1127.0 | 0 |
| 1126.0 | 0 |
| 1125.0 | 0 |
| 1124.0 | 0 |
| 1123.0 | 0 |
| 1122.0 | 0 |
| 1121.0 | 0 |
| 1120.0 | 0 |
| 1119.0 | 0 |
| 1118.0 | 0 |
| 1117.0 | 0 |
| 1116.0 | 0 |
| 1115.0 | 0 |
| 1114.0 | 0 |
| 1113.0 | 0 |
| 1112.0 | 0 |
| 1111.0 | 0 |
| 1110.0 | 0 |
| 1109.0 | 0 |
| 1108.0 | 0 |
| 1107.0 | 0 |
| 1106.0 | 0 |
| 1105.0 | 0 |
| 1104.0 | 0 |
| 1103.0 | 0 |
| 1102.0 | 0 |
| 1101.0 | 0 |
| 1100.0 | 0 |
| 1099.0 | 0 |
| 1098.0 | 0 |
| 1097.0 | 0 |
| 1096.0 | 0 |
| 1095.0 | 0 |
| 1094.0 | 0 |
| 1093.0 | 0 |
| 1092.0 | 0 |
| 1091.0 | 0 |
| 1090.0 | 0 |
| 1089.0 | 0 |
| 1088.0 | 0 |
| 1087.0 | 0 |
| 1086.0 | 0 |
| 1085.0 | 0 |
| 1084.0 | 0 |
| 1083.0 | 0 |
| 1082.0 | 0 |
| 1081.0 | 0 |
| 1080.0 | 0 |
| 1079.0 | 0 |
| 1078.0 | 0 |
| 1077.0 | 0 |
| 1076.0 | 0 |
| 1075.0 | 0 |
| 1074.0 | 0 |
| 1073.0 | 0 |
| 1072.0 | 0 |
| 1071.0 | 0 |
| 1070.0 | 0 |
| 1069.0 | 0 |
| 1068.0 | 0 |
| 1067.0 | 0 |
| 1066.0 | 0 |
| 1065.0 | 0 |
| 1064.0 | 0 |
| 1063.0 | 0 |
| 1062.0 | 0 |
| 1061.0 | 0 |
| 1060.0 | 0 |
| 1059.0 | 0 |
| 1058.0 | 0 |
| 1057.0 | 0 |
| 1056.0 | 0 |
| 1055.0 | 0 |
| 1054.0 | 0 |
| 1053.0 | 0 |
| 1052.0 | 0 |
| 1051.0 | 0 |
| 1050.0 | 0 |
| 1049.0 | 0 |
| 1048.0 | 0 |
| 1047.0 | 0 |
| 1046.0 | 0 |
| 1045.0 | 0 |
| 1044.0 | 0 |
| 1043.0 | 0 |
| 1042.0 | 0 |
| 1041.0 | 0 |
| 1040.0 | 0 |
| 1039.0 | 0 |
| 1038.0 | 0 |
| 1037.0 | 0 |
| 1036.0 | 0 |
| 1035.0 | 0 |
| 1034.0 | 0 |
| 1033.0 | 0 |
| 1032.0 | 0 |
| 1031.0 | 0 |
| 1030.0 | 0 |
| 1029.0 | 0 |
| 1028.0 | 0 |
| 1027.0 | 0 |
| 1026.0 | 0 |
| 1025.0 | 0 |
| 1024.0 | 0 |
| 1023.0 | 0 |
| 1022.0 | 0 |
| 1021.0 | 0 |
| 1020.0 | 0 |
| 1019.0 | 0 |
| 1018.0 | 0 |
| 1017.0 | 0 |
| 1016.0 | 0 |
| 1015.0 | 0 |
| 1014.0 | 0 |
| 1013.0 | 0 |
| 1012.0 | 0 |
| 1011.0 | 0 |
| 1010.0 | 0 |
| 1009.0 | 0 |
| 1008.0 | 0 |
| 1007.0 | 0 |
| 1006.0 | 0 |
| 1005.0 | 0 |
| 1004.0 | 0 |
| 1003.0 | 0 |
| 1002.0 | 0 |
| 1001.0 | 0 |
| 1000.0 | 0 |
| 999.0 | 0 |
| 998.0 | 0 |
| 997.0 | 0 |
| 996.0 | 0 |
| 995.0 | 0 |
| 994.0 | 0 |
| 993.0 | 0 |
| 992.0 | 0 |
| 991.0 | 0 |
| 990.0 | 0 |
| 989.0 | 0 |
| 988.0 | 0 |
| 987.0 | 0 |
| 986.0 | 0 |
| 985.0 | 0 |
| 984.0 | 0 |
| 983.0 | 0 |
| 982.0 | 0 |
| 981.0 | 0 |
| 980.0 | 0 |
| 979.0 | 0 |
| 978.0 | 0 |
| 977.0 | 0 |
| 976.0 | 0 |
| 975.0 | 0 |
| 974.0 | 0 |
| 973.0 | 0 |
| 972.0 | 0 |
| 971.0 | 0 |
| 970.0 | 0 |
| 969.0 | 0 |
| 968.0 | 0 |
| 967.0 | 0 |
| 966.0 | 0 |
| 965.0 | 0 |
| 964.0 | 0 |
| 963.0 | 0 |
| 962.0 | 0 |
| 961.0 | 0 |
| 960.0 | 0 |
| 959.0 | 0 |
| 958.0 | 0 |
| 957.0 | 0 |
| 956.0 | 0 |
| 955.0 | 0 |
| 954.0 | 0 |
| 953.0 | 0 |
| 952.0 | 0 |
| 951.0 | 0 |
| 950.0 | 0 |
| 949.0 | 0 |
| 948.0 | 0 |
| 947.0 | 0 |
| 946.0 | 0 |
| 945.0 | 0 |
| 944.0 | 0 |
| 943.0 | 0 |
| 942.0 | 0 |
| 941.0 | 0 |
| 940.0 | 0 |
| 939.0 | 0 |
| 938.0 | 0 |
| 937.0 | 0 |
| 936.0 | 0 |
| 935.0 | 0 |
| 934.0 | 0 |
| 933.0 | 0 |
| 932.0 | 0 |
| 931.0 | 0 |
| 930.0 | 0 |
| 929.0 | 0 |
| 928.0 | 0 |
| 927.0 | 0 |
| 926.0 | 0 |
| 925.0 | 0 |
| 924.0 | 0 |
| 923.0 | 0 |
| 922.0 | 0 |
| 921.0 | 0 |
| 920.0 | 0 |
| 919.0 | 0 |
| 918.0 | 0 |
| 917.0 | 0 |
| 916.0 | 0 |
| 915.0 | 0 |
| 914.0 | 0 |
| 913.0 | 0 |
| 912.0 | 0 |
| 911.0 | 0 |
| 910.0 | 0 |
| 909.0 | 0 |
| 908.0 | 0 |
| 907.0 | 0 |
| 906.0 | 0 |
| 905.0 | 0 |
| 904.0 | 0 |
| 903.0 | 0 |
| 902.0 | 0 |
| 901.0 | 0 |
| 900.0 | 0 |
| 899.0 | 0 |
| 898.0 | 0 |
| 897.0 | 0 |
| 896.0 | 0 |
| 895.0 | 0 |
| 894.0 | 0 |
| 893.0 | 0 |
| 892.0 | 0 |
| 891.0 | 0 |
| 890.0 | 0 |
| 889.0 | 0.001 |
| 888.0 | 0.001 |
| 887.0 | 0.001 |
| 886.0 | 0.001 |
| 885.0 | 0.001 |
| 884.0 | 0.001 |
| 883.0 | 0.001 |
| 882.0 | 0.001 |
| 881.0 | 0.001 |
| 880.0 | 0.001 |
| 879.0 | 0.001 |
| 878.0 | 0.001 |
| 877.0 | 0.001 |
| 876.0 | 0.001 |
| 875.0 | 0.001 |
| 874.0 | 0.001 |
| 873.0 | 0.001 |
| 872.0 | 0.001 |
| 871.0 | 0.001 |
| 870.0 | 0.001 |
| 869.0 | 0.001 |
| 868.0 | 0.001 |
| 867.0 | 0.001 |
| 866.0 | 0.001 |
| 865.0 | 0.001 |
| 864.0 | 0 |
| 863.0 | 0 |
| 862.0 | 0 |
| 861.0 | 0 |
| 860.0 | 0 |
| 859.0 | 0 |
| 858.0 | 0 |
| 857.0 | 0 |
| 856.0 | 0 |
| 855.0 | 0 |
| 854.0 | 0 |
| 853.0 | 0.001 |
| 852.0 | 0.001 |
| 851.0 | 0 |
| 850.0 | 0.001 |
| 849.0 | 0.001 |
| 848.0 | 0.001 |
| 847.0 | 0.001 |
| 846.0 | 0.001 |
| 845.0 | 0.001 |
| 844.0 | 0.001 |
| 843.0 | 0.001 |
| 842.0 | 0.001 |
| 841.0 | 0.001 |
| 840.0 | 0.001 |
| 839.0 | 0.001 |
| 838.0 | 0.001 |
| 837.0 | 0.001 |
| 836.0 | 0.001 |
| 835.0 | 0.001 |
| 834.0 | 0.001 |
| 833.0 | 0.001 |
| 832.0 | 0.001 |
| 831.0 | 0.001 |
| 830.0 | 0.001 |
| 829.0 | 0.001 |
| 828.0 | 0.001 |
| 827.0 | 0.001 |
| 826.0 | 0.001 |
| 825.0 | 0.001 |
| 824.0 | 0.001 |
| 823.0 | 0.001 |
| 822.0 | 0.001 |
| 821.0 | 0.001 |
| 820.0 | 0.001 |
| 819.0 | 0.001 |
| 818.0 | 0.001 |
| 817.0 | 0.001 |
| 816.0 | 0.001 |
| 815.0 | 0.001 |
| 814.0 | 0.001 |
| 813.0 | 0.001 |
| 812.0 | 0.001 |
| 811.0 | 0.001 |
| 810.0 | 0.001 |
| 809.0 | 0.001 |
| 808.0 | 0.002 |
| 807.0 | 0.002 |
| 806.0 | 0.001 |
| 805.0 | 0.002 |
| 804.0 | 0.002 |
| 803.0 | 0.002 |
| 802.0 | 0.002 |
| 801.0 | 0.002 |
| 800.0 | 0.002 |
| 799.0 | 0 |
| 798.0 | 0 |
| 797.0 | 0 |
| 796.0 | 0 |
| 795.0 | 0 |
| 794.0 | 0 |
| 793.0 | 0 |
| 792.0 | 0 |
| 791.0 | 0 |
| 790.0 | 0 |
| 789.0 | 0 |
| 788.0 | 0 |
| 787.0 | 0 |
| 786.0 | 0 |
| 785.0 | 0 |
| 784.0 | 0 |
| 783.0 | 0 |
| 782.0 | 0 |
| 781.0 | 0 |
| 780.0 | 0 |
| 779.0 | 0 |
| 778.0 | 0 |
| 777.0 | 0 |
| 776.0 | 0 |
| 775.0 | 0 |
| 774.0 | 0 |
| 773.0 | 0 |
| 772.0 | 0 |
| 771.0 | 0 |
| 770.0 | 0 |
| 769.0 | 0.001 |
| 768.0 | 0.001 |
| 767.0 | 0.001 |
| 766.0 | 0.001 |
| 765.0 | 0.001 |
| 764.0 | 0 |
| 763.0 | 0 |
| 762.0 | 0 |
| 761.0 | 0 |
| 760.0 | 0 |
| 759.0 | 0 |
| 758.0 | 0 |
| 757.0 | 0 |
| 756.0 | 0 |
| 755.0 | 0 |
| 754.0 | 0 |
| 753.0 | 0 |
| 752.0 | 0 |
| 751.0 | 0 |
| 750.0 | 0 |
| 749.0 | 0 |
| 748.0 | 0 |
| 747.0 | 0 |
| 746.0 | 0 |
| 745.0 | 0 |
| 744.0 | 0 |
| 743.0 | 0 |
| 742.0 | 0 |
| 741.0 | 0 |
| 740.0 | 0 |
| 739.0 | 0 |
| 738.0 | 0 |
| 737.0 | 0 |
| 736.0 | 0 |
| 735.0 | 0 |
| 734.0 | 0 |
| 733.0 | 0 |
| 732.0 | 0 |
| 731.0 | 0 |
| 730.0 | 0 |
| 729.0 | 0 |
| 728.0 | 0 |
| 727.0 | 0 |
| 726.0 | 0 |
| 725.0 | 0 |
| 724.0 | 0 |
| 723.0 | 0 |
| 722.0 | 0 |
| 721.0 | 0 |
| 720.0 | 0 |
| 719.0 | 0 |
| 718.0 | 0 |
| 717.0 | 0 |
| 716.0 | 0 |
| 715.0 | 0 |
| 714.0 | 0 |
| 713.0 | 0 |
| 712.0 | 0 |
| 711.0 | 0 |
| 710.0 | 0 |
| 709.0 | 0 |
| 708.0 | 0 |
| 707.0 | 0 |
| 706.0 | 0 |
| 705.0 | 0 |
| 704.0 | 0 |
| 703.0 | 0 |
| 702.0 | 0 |
| 701.0 | 0 |
| 700.0 | 0 |
| 699.0 | 0 |
| 698.0 | 0 |
| 697.0 | 0 |
| 696.0 | 0 |
| 695.0 | 0 |
| 694.0 | 0 |
| 693.0 | 0 |
| 692.0 | 0 |
| 691.0 | 0 |
| 690.0 | 0 |
| 689.0 | 0 |
| 688.0 | 0 |
| 687.0 | 0 |
| 686.0 | 0 |
| 685.0 | 0 |
| 684.0 | 0 |
| 683.0 | 0 |
| 682.0 | 0 |
| 681.0 | 0 |
| 680.0 | 0 |
| 679.0 | 0 |
| 678.0 | 0 |
| 677.0 | 0 |
| 676.0 | 0 |
| 675.0 | 0 |
| 674.0 | 0 |
| 673.0 | 0 |
| 672.0 | 0 |
| 671.0 | 0 |
| 670.0 | 0 |
| 669.0 | 0 |
| 668.0 | 0 |
| 667.0 | 0 |
| 666.0 | 0.001 |
| 665.0 | 0.001 |
| 664.0 | 0.001 |
| 663.0 | 0.001 |
| 662.0 | 0.002 |
| 661.0 | 0.002 |
| 660.0 | 0.002 |
| 659.0 | 0.003 |
| 658.0 | 0.003 |
| 657.0 | 0.004 |
| 656.0 | 0.004 |
| 655.0 | 0.005 |
| 654.0 | 0.006 |
| 653.0 | 0.006 |
| 652.0 | 0.007 |
| 651.0 | 0.008 |
| 650.0 | 0.009 |
| 649.0 | 0.011 |
| 648.0 | 0.012 |
| 647.0 | 0.015 |
| 646.0 | 0.017 |
| 645.0 | 0.02 |
| 644.0 | 0.024 |
| 643.0 | 0.029 |
| 642.0 | 0.035 |
| 641.0 | 0.043 |
| 640.0 | 0.052 |
| 639.0 | 0.065 |
| 638.0 | 0.081 |
| 637.0 | 0.102 |
| 636.0 | 0.13 |
| 635.0 | 0.167 |
| 634.0 | 0.218 |
| 633.0 | 0.286 |
| 632.0 | 0.382 |
| 631.0 | 0.516 |
| 630.0 | 0.706 |
| 629.0 | 0.982 |
| 628.0 | 1.381 |
| 627.0 | 1.98 |
| 626.0 | 2.886 |
| 625.0 | 4.252 |
| 624.0 | 6.338 |
| 623.0 | 9.494 |
| 622.0 | 14.138 |
| 621.0 | 20.635 |
| 620.0 | 28.794 |
| 619.0 | 38.033 |
| 618.0 | 46.915 |
| 617.0 | 54.066 |
| 616.0 | 58.736 |
| 615.0 | 61.203 |
| 614.0 | 62.237 |
| 613.0 | 62.54 |
| 612.0 | 62.632 |
| 611.0 | 62.812 |
| 610.0 | 63.273 |
| 609.0 | 64.055 |
| 608.0 | 65.131 |
| 607.0 | 66.493 |
| 606.0 | 68.045 |
| 605.0 | 69.757 |
| 604.0 | 71.533 |
| 603.0 | 73.232 |
| 602.0 | 74.826 |
| 601.0 | 76.194 |
| 600.0 | 77.21 |
| 599.0 | 77.84 |
| 598.0 | 77.991 |
| 597.0 | 77.479 |
| 596.0 | 76.226 |
| 595.0 | 74.224 |
| 594.0 | 71.568 |
| 593.0 | 68.408 |
| 592.0 | 65.148 |
| 591.0 | 62.244 |
| 590.0 | 60.185 |
| 589.0 | 59.637 |
| 588.0 | 61.248 |
| 587.0 | 65.44 |
| 586.0 | 71.208 |
| 585.0 | 73.618 |
| 584.0 | 65.67 |
| 583.0 | 47.19 |
| 582.0 | 27.462 |
| 581.0 | 14.142 |
| 580.0 | 7.102 |
| 579.0 | 3.707 |
| 578.0 | 2.042 |
| 577.0 | 1.177 |
| 576.0 | 0.715 |
| 575.0 | 0.448 |
| 574.0 | 0.29 |
| 573.0 | 0.193 |
| 572.0 | 0.132 |
| 571.0 | 0.092 |
| 570.0 | 0.065 |
| 569.0 | 0.047 |
| 568.0 | 0.034 |
| 567.0 | 0.026 |
| 566.0 | 0.019 |
| 565.0 | 0.015 |
| 564.0 | 0.011 |
| 563.0 | 0.009 |
| 562.0 | 0.007 |
| 561.0 | 0.006 |
| 560.0 | 0.005 |
| 559.0 | 0.004 |
| 558.0 | 0.003 |
| 557.0 | 0.003 |
| 556.0 | 0.002 |
| 555.0 | 0.002 |
| 554.0 | 0.002 |
| 553.0 | 0.001 |
| 552.0 | 0.001 |
| 551.0 | 0.001 |
| 550.0 | 0.001 |
| 549.0 | 0.001 |
| 548.0 | 0.001 |
| 547.0 | 0.001 |
| 546.0 | 0 |
| 545.0 | 0 |
| 544.0 | 0 |
| 543.0 | 0 |
| 542.0 | 0 |
| 541.0 | 0 |
| 540.0 | 0 |
| 539.0 | 0 |
| 538.0 | 0 |
| 537.0 | 0 |
| 536.0 | 0 |
| 535.0 | 0 |
| 534.0 | 0 |
| 533.0 | 0 |
| 532.0 | 0 |
| 531.0 | 0 |
| 530.0 | 0 |
| 529.0 | 0 |
| 528.0 | 0 |
| 527.0 | 0 |
| 526.0 | 0 |
| 525.0 | 0 |
| 524.0 | 0 |
| 523.0 | 0 |
| 522.0 | 0 |
| 521.0 | 0 |
| 520.0 | 0 |
| 519.0 | 0 |
| 518.0 | 0 |
| 517.0 | 0 |
| 516.0 | 0 |
| 515.0 | 0 |
| 514.0 | 0 |
| 513.0 | 0 |
| 512.0 | 0 |
| 511.0 | 0 |
| 510.0 | 0 |
| 509.0 | 0 |
| 508.0 | 0 |
| 507.0 | 0 |
| 506.0 | 0 |
| 505.0 | 0 |
| 504.0 | 0 |
| 503.0 | 0 |
| 502.0 | 0 |
| 501.0 | 0 |
| 500.0 | 0 |
| 499.0 | 0 |
| 498.0 | 0 |
| 497.0 | 0 |
| 496.0 | 0 |
| 495.0 | 0 |
| 494.0 | 0 |
| 493.0 | 0 |
| 492.0 | 0 |
| 491.0 | 0 |
| 490.0 | 0 |
| 489.0 | 0 |
| 488.0 | 0 |
| 487.0 | 0 |
| 486.0 | 0 |
| 485.0 | 0 |
| 484.0 | 0 |
| 483.0 | 0 |
| 482.0 | 0 |
| 481.0 | 0 |
| 480.0 | 0 |
| 479.0 | 0 |
| 478.0 | 0 |
| 477.0 | 0 |
| 476.0 | 0 |
| 475.0 | 0 |
| 474.0 | 0 |
| 473.0 | 0 |
| 472.0 | 0 |
| 471.0 | 0 |
| 470.0 | 0 |
| 469.0 | 0 |
| 468.0 | 0 |
| 467.0 | 0 |
| 466.0 | 0 |
| 465.0 | 0 |
| 464.0 | 0 |
| 463.0 | 0 |
| 462.0 | 0 |
| 461.0 | 0 |
| 460.0 | 0 |
| 459.0 | 0 |
| 458.0 | 0 |
| 457.0 | 0 |
| 456.0 | 0.002 |
| 455.0 | 0.006 |
| 454.0 | 0.012 |
| 453.0 | 0.017 |
| 452.0 | 0.015 |
| 451.0 | 0.011 |
| 450.0 | 0.012 |
| 449.0 | 0.02 |
| 448.0 | 0.032 |
| 447.0 | 0.041 |
| 446.0 | 0.041 |
| 445.0 | 0.037 |
| 444.0 | 0.037 |
| 443.0 | 0.046 |
| 442.0 | 0.063 |
| 441.0 | 0.085 |
| 440.0 | 0.103 |
| 439.0 | 0.105 |
| 438.0 | 0.093 |
| 437.0 | 0.078 |
| 436.0 | 0.066 |
| 435.0 | 0.06 |
| 434.0 | 0.06 |
| 433.0 | 0.06 |
| 432.0 | 0.049 |
| 431.0 | 0.028 |
| 430.0 | 0.012 |
| 429.0 | 0.005 |
| 428.0 | 0.002 |
| 427.0 | 0.001 |
| 426.0 | 0.001 |
| 425.0 | 0.001 |
| 424.0 | 0.001 |
| 423.0 | 0.001 |
| 422.0 | 0 |
| 421.0 | 0 |
| 420.0 | 0 |
| 419.0 | 0 |
| 418.0 | 0 |
| 417.0 | 0.001 |
| 416.0 | 0.001 |
| 415.0 | 0.001 |
| 414.0 | 0 |
| 413.0 | 0 |
| 412.0 | 0 |
| 411.0 | 0 |
| 410.0 | 0 |
| 409.0 | 0 |
| 408.0 | 0 |
| 407.0 | 0 |
| 406.0 | 0 |
| 405.0 | 0 |
| 404.0 | 0 |
| 403.0 | 0 |
| 402.0 | 0 |
| 401.0 | 0 |
| 400.0 | 0 |
| 399.0 | 0 |
| 398.0 | 0 |
| 397.0 | 0 |
| 396.0 | 0 |
| 395.0 | 0 |
| 394.0 | 0 |
| 393.0 | 0 |
| 392.0 | 0 |
| 391.0 | 0 |
| 390.0 | 0 |
| 389.0 | 0 |
| 388.0 | 0 |
| 387.0 | 0 |
| 386.0 | 0 |
| 385.0 | 0 |
| 384.0 | 0 |
| 383.0 | 0 |
| 382.0 | 0 |
| 381.0 | 0 |
| 380.0 | 0 |
| 379.0 | 0 |
| 378.0 | 0 |
| 377.0 | 0 |
| 376.0 | 0 |
| 375.0 | 0 |
| 374.0 | 0 |
| 373.0 | 0 |
| 372.0 | 0 |
| 371.0 | 0 |
| 370.0 | 0 |
| 369.0 | 0 |
| 368.0 | 0 |
| 367.0 | 0 |
| 366.0 | 0 |
| 365.0 | 0 |
| 364.0 | 0 |
| 363.0 | 0 |
| 362.0 | 0 |
| 361.0 | 0 |
| 360.0 | 0 |
| 359.0 | 0 |
| 358.0 | 0 |
| 357.0 | 0 |
| 356.0 | 0 |
| 355.0 | 0 |
| 354.0 | 0 |
| 353.0 | 0 |
| 352.0 | 0 |
| 351.0 | 0 |
| 350.0 | 0 |
| 349.0 | 0 |
| 348.0 | 0 |
| 347.0 | 0 |
| 346.0 | 0 |
| 345.0 | 0 |
| 344.0 | 0 |
| 343.0 | 0 |
| 342.0 | 0 |
| 341.0 | 0 |
| 340.0 | 0 |
| 339.0 | 0 |
| 338.0 | 0 |
| 337.0 | 0 |
| 336.0 | 0 |
| 335.0 | 0 |
| 334.0 | 0 |
| 333.0 | 0 |
| 332.0 | 0 |
| 331.0 | 0 |
| 330.0 | 0 |
| 329.0 | 0 |
| 328.0 | 0 |
| 327.0 | 0 |
| 326.0 | 0 |
| 325.0 | 0 |
| 324.0 | 0 |
| 323.0 | 0 |
| 322.0 | 0 |
| 321.0 | 0 |
| 320.0 | 0 |
| 319.0 | 0 |
| 318.0 | 0 |
| 317.0 | 0 |
| 316.0 | 0 |
| 315.0 | 0 |
| 314.0 | 0 |
| 313.0 | 0 |
| 312.0 | 0 |
| 311.0 | 0 |
| 310.0 | 0 |
| 309.0 | 0 |
| 308.0 | 0 |
| 307.0 | 0 |
| 306.0 | 0 |
| 305.0 | 0 |
| 304.0 | 0 |
| 303.0 | 0 |
| 302.0 | 0 |
| 301.0 | 0 |
| 300.0 | 0 |
| 299.0 | 0 |
| 298.0 | 0 |
| 297.0 | 0 |
| 296.0 | 0 |
| 295.0 | 0 |
| 294.0 | 0 |
| 293.0 | 0 |
| 292.0 | 0 |
| 291.0 | 0 |
| 290.0 | 0 |
| 289.0 | 0 |
| 288.0 | 0 |
| 287.0 | 0 |
| 286.0 | 0 |
| 285.0 | 0 |
| 284.0 | 0 |
| 283.0 | 0 |
| 282.0 | 0 |
| 281.0 | 0 |
| 280.0 | 0 |
| 279.0 | 0 |
| 278.0 | 0 |
| 277.0 | 0 |
| 276.0 | 0 |
| 275.0 | 0 |
| 274.0 | 0 |
| 273.0 | 0 |
| 272.0 | 0 |
| 271.0 | 0 |
| 270.0 | 0 |
| 269.0 | 0 |
| 268.0 | 0 |
| 267.0 | 0 |
| 266.0 | 0 |
| 265.0 | 0 |
| 264.0 | 0 |
| 263.0 | 0 |
| 262.0 | 0 |
| 261.0 | 0 |
| 260.0 | 0 |
| 259.0 | 0 |
| 258.0 | 0 |
| 257.0 | 0 |
| 256.0 | 0 |
| 255.0 | 0 |
| 254.0 | 0 |
| 253.0 | 0 |
| 252.0 | 0 |
| 251.0 | 0 |
| 250.0 | 0 |
| 249.0 | 0 |
| 248.0 | 0 |
| 247.0 | 0 |
| 246.0 | 0 |
| 245.0 | 0 |
| 244.0 | 0 |
| 243.0 | 0 |
| 242.0 | 0 |
| 241.0 | 0 |
| 240.0 | 0 |
| 239.0 | 0 |
| 238.0 | 0 |
| 237.0 | 0 |
| 236.0 | 0 |
| 235.0 | 0 |
| 234.0 | 0 |
| 233.0 | 0.001 |
| 232.0 | 0.001 |
| 231.0 | 0.001 |
| 230.0 | 0.001 |
| 229.0 | 0.001 |
| 228.0 | 0.001 |
| 227.0 | 0.001 |
| 226.0 | 0.001 |
| 225.0 | 0.001 |
| 224.0 | 0.001 |
| 223.0 | 0.001 |
| 222.0 | 0.001 |
| 221.0 | 0.001 |
| 220.0 | 0.001 |
| 219.0 | 0.001 |
| 218.0 | 0.001 |
| 217.0 | 0.001 |
| 216.0 | 0.001 |
| 215.0 | 0.001 |
| 214.0 | 0.001 |
| 213.0 | 0.001 |
| 212.0 | 0.001 |
| 211.0 | 0.001 |
| 210.0 | 0.001 |
| 209.0 | 0.001 |
| 208.0 | 0.001 |
| 207.0 | 0.001 |
| 206.0 | 0.001 |
| 205.0 | 0.001 |
| 204.0 | 0.001 |
| 203.0 | 0.001 |
| 202.0 | 0.001 |
| 201.0 | 0.001 |